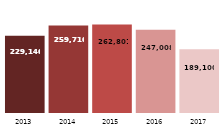
| Category | Petróleo Bruto  (m3) |
|---|---|
| 2013.0 | 229146 |
| 2014.0 | 259716.354 |
| 2015.0 | 262800.833 |
| 2016.0 | 247007.968 |
| 2017.0 | 189099.834 |